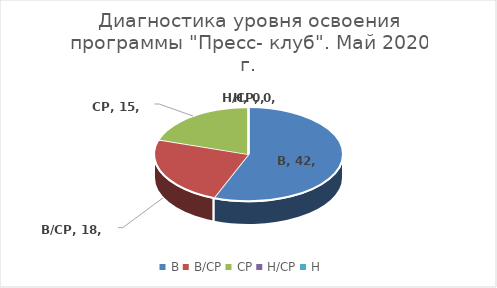
| Category | Series 0 |
|---|---|
| В | 42 |
| В/СР | 18 |
| СР | 15 |
| Н/СР | 0 |
| Н | 0 |